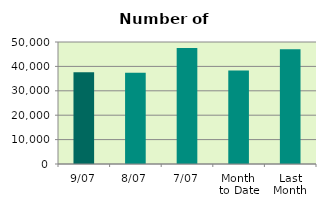
| Category | Series 0 |
|---|---|
| 9/07 | 37598 |
| 8/07 | 37350 |
| 7/07 | 47514 |
| Month 
to Date | 38304.286 |
| Last
Month | 46980.273 |